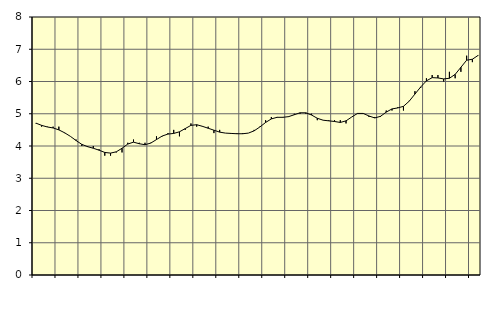
| Category | Piggar | Information och kommunikation, SNI 58-63 |
|---|---|---|
| nan | 4.7 | 4.71 |
| 1.0 | 4.6 | 4.64 |
| 1.0 | 4.6 | 4.59 |
| 1.0 | 4.6 | 4.56 |
| nan | 4.6 | 4.5 |
| 2.0 | 4.4 | 4.41 |
| 2.0 | 4.3 | 4.3 |
| 2.0 | 4.2 | 4.17 |
| nan | 4 | 4.05 |
| 3.0 | 4 | 3.98 |
| 3.0 | 4 | 3.93 |
| 3.0 | 3.9 | 3.87 |
| nan | 3.7 | 3.8 |
| 4.0 | 3.7 | 3.78 |
| 4.0 | 3.8 | 3.82 |
| 4.0 | 3.8 | 3.93 |
| nan | 4.1 | 4.06 |
| 5.0 | 4.2 | 4.12 |
| 5.0 | 4.1 | 4.07 |
| 5.0 | 4.1 | 4.04 |
| nan | 4.1 | 4.09 |
| 6.0 | 4.3 | 4.2 |
| 6.0 | 4.3 | 4.31 |
| 6.0 | 4.4 | 4.37 |
| nan | 4.5 | 4.39 |
| 7.0 | 4.3 | 4.44 |
| 7.0 | 4.5 | 4.54 |
| 7.0 | 4.7 | 4.64 |
| nan | 4.6 | 4.66 |
| 8.0 | 4.6 | 4.61 |
| 8.0 | 4.6 | 4.55 |
| 8.0 | 4.4 | 4.49 |
| nan | 4.5 | 4.43 |
| 9.0 | 4.4 | 4.4 |
| 9.0 | 4.4 | 4.39 |
| 9.0 | 4.4 | 4.38 |
| nan | 4.4 | 4.38 |
| 10.0 | 4.4 | 4.4 |
| 10.0 | 4.5 | 4.47 |
| 10.0 | 4.6 | 4.59 |
| nan | 4.8 | 4.73 |
| 11.0 | 4.9 | 4.84 |
| 11.0 | 4.9 | 4.89 |
| 11.0 | 4.9 | 4.89 |
| nan | 4.9 | 4.91 |
| 12.0 | 5 | 4.97 |
| 12.0 | 5 | 5.03 |
| 12.0 | 5 | 5.03 |
| nan | 5 | 4.96 |
| 13.0 | 4.8 | 4.86 |
| 13.0 | 4.8 | 4.8 |
| 13.0 | 4.8 | 4.78 |
| nan | 4.8 | 4.76 |
| 14.0 | 4.8 | 4.73 |
| 14.0 | 4.7 | 4.78 |
| 14.0 | 4.9 | 4.9 |
| nan | 5 | 5.01 |
| 15.0 | 5 | 5.01 |
| 15.0 | 4.9 | 4.93 |
| 15.0 | 4.9 | 4.87 |
| nan | 4.9 | 4.92 |
| 16.0 | 5.1 | 5.05 |
| 16.0 | 5.1 | 5.15 |
| 16.0 | 5.2 | 5.18 |
| nan | 5.1 | 5.23 |
| 17.0 | 5.4 | 5.39 |
| 17.0 | 5.7 | 5.61 |
| 17.0 | 5.8 | 5.83 |
| nan | 6.1 | 6.02 |
| 18.0 | 6.2 | 6.12 |
| 18.0 | 6.2 | 6.11 |
| 18.0 | 6 | 6.08 |
| nan | 6.3 | 6.1 |
| 19.0 | 6.1 | 6.22 |
| 19.0 | 6.3 | 6.44 |
| 19.0 | 6.8 | 6.66 |
| nan | 6.6 | 6.69 |
| 20.0 | 6.8 | 6.81 |